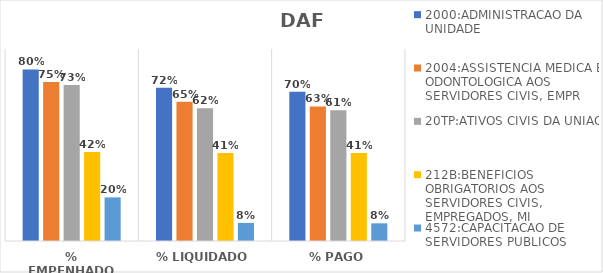
| Category | 2000:ADMINISTRACAO DA UNIDADE | 2004:ASSISTENCIA MEDICA E ODONTOLOGICA AOS SERVIDORES CIVIS, EMPR | 20TP:ATIVOS CIVIS DA UNIAO | 212B:BENEFICIOS OBRIGATORIOS AOS SERVIDORES CIVIS, EMPREGADOS, MI | 4572:CAPACITACAO DE SERVIDORES PUBLICOS FEDERAIS EM PROCESSO DE Q |
|---|---|---|---|---|---|
| % EMPENHADO | 0.804 | 0.745 | 0.731 | 0.417 | 0.204 |
| % LIQUIDADO | 0.719 | 0.653 | 0.622 | 0.412 | 0.085 |
| % PAGO | 0.699 | 0.631 | 0.613 | 0.412 | 0.083 |